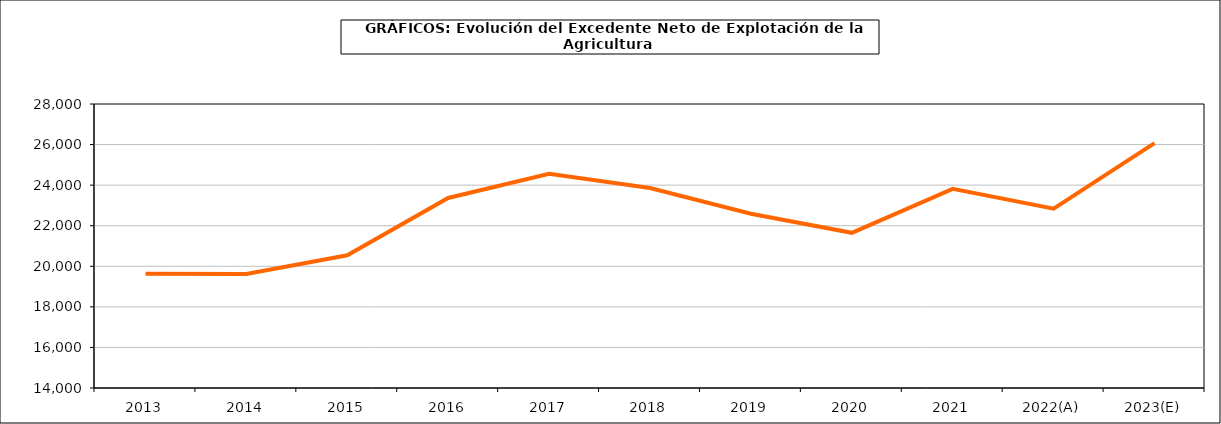
| Category | excedente neto de explotacion |
|---|---|
| 2013 | 19635.617 |
| 2014 | 19616.041 |
| 2015 | 20539.815 |
| 2016 | 23367.672 |
| 2017 | 24560.03 |
| 2018 | 23855 |
| 2019 | 22592.02 |
| 2020 | 21650.775 |
| 2021 | 23817.623 |
| 2022(A) | 22836.304 |
| 2023(E) | 26072.939 |